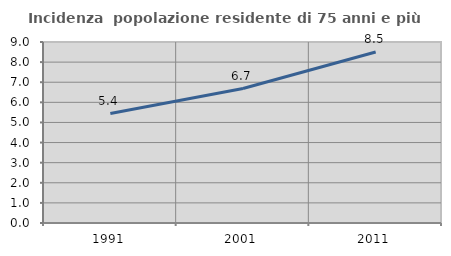
| Category | Incidenza  popolazione residente di 75 anni e più |
|---|---|
| 1991.0 | 5.442 |
| 2001.0 | 6.686 |
| 2011.0 | 8.502 |